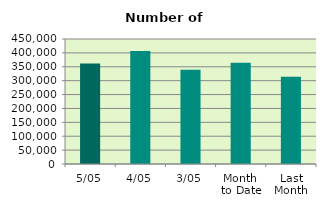
| Category | Series 0 |
|---|---|
| 5/05 | 361362 |
| 4/05 | 406684 |
| 3/05 | 339538 |
| Month 
to Date | 364765.5 |
| Last
Month | 313751.158 |